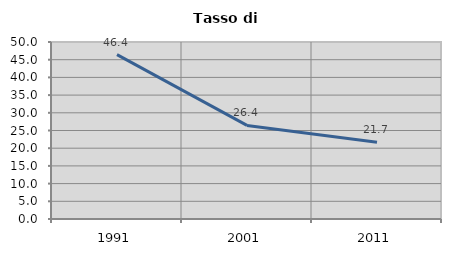
| Category | Tasso di disoccupazione   |
|---|---|
| 1991.0 | 46.439 |
| 2001.0 | 26.439 |
| 2011.0 | 21.709 |